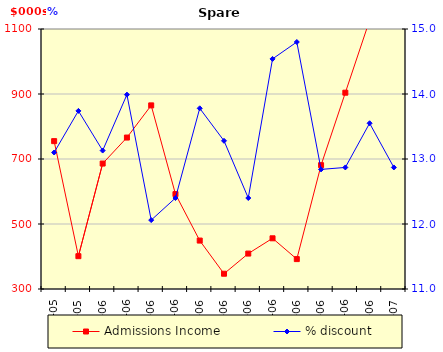
| Category | Admissions Income |
|---|---|
| 2005-11-01 | 755 |
| 2005-12-01 | 401 |
| 2006-01-01 | 686 |
| 2006-02-01 | 766 |
| 2006-03-01 | 865 |
| 2006-04-01 | 592 |
| 2006-05-01 | 449 |
| 2006-06-01 | 347 |
| 2006-07-01 | 409 |
| 2006-08-01 | 456 |
| 2006-09-01 | 392 |
| 2006-10-01 | 681 |
| 2006-11-01 | 904 |
| 2006-12-01 | 1127 |
| 2007-01-01 | 1350 |